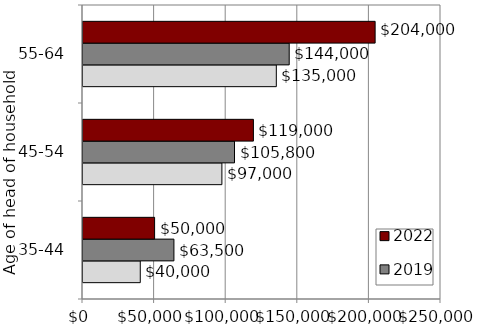
| Category | 2016 | 2019 | 2022 |
|---|---|---|---|
| 35-44 | 40000 | 63500 | 50000 |
| 45-54 | 97000 | 105800 | 119000 |
| 55-64 | 135000 | 144000 | 204000 |